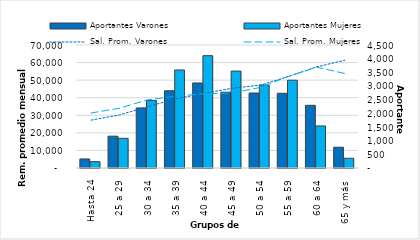
| Category | Aportantes Varones | Aportantes Mujeres |
|---|---|---|
| Hasta 24 | 331 | 232 |
| 25 a 29 | 1164 | 1086 |
| 30 a 34 | 2197 | 2473 |
| 35 a 39 | 2826 | 3587 |
| 40 a 44 | 3112 | 4110 |
| 45 a 49 | 2773 | 3546 |
| 50 a 54 | 2743 | 3035 |
| 55 a 59 | 2732 | 3211 |
| 60 a 64 | 2294 | 1539 |
| 65 y más | 760 | 356 |